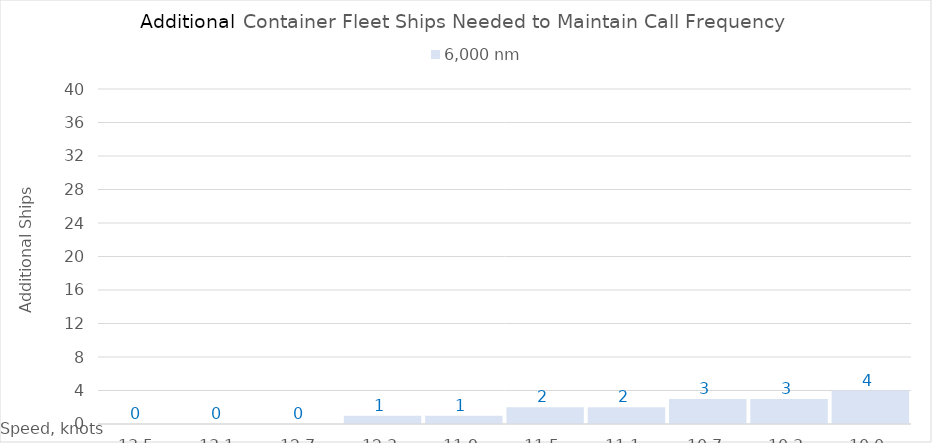
| Category | 6,000 |
|---|---|
| 13.5 | 0 |
| 13.1 | 0 |
| 12.7 | 0 |
| 12.299999999999999 | 1 |
| 11.899999999999999 | 1 |
| 11.499999999999998 | 2 |
| 11.099999999999998 | 2 |
| 10.699999999999998 | 3 |
| 10.299999999999997 | 3 |
| 10.0 | 4 |